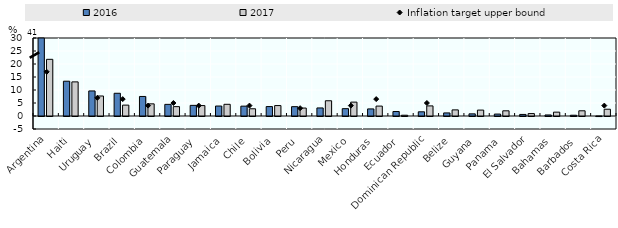
| Category | 2016 | 2017 |
|---|---|---|
| Argentina | 40.7 | 21.8 |
| Haiti | 13.378 | 13.125 |
| Uruguay | 9.639 | 7.693 |
| Brazil | 8.739 | 4.184 |
| Colombia | 7.513 | 4.675 |
| Guatemala | 4.472 | 3.605 |
| Paraguay | 4.087 | 4.011 |
| Jamaica | 3.831 | 4.5 |
| Chile | 3.787 | 2.777 |
| Bolivia | 3.625 | 4.011 |
| Peru | 3.593 | 3.057 |
| Nicaragua | 3.1 | 5.861 |
| Mexico | 2.822 | 5.342 |
| Honduras | 2.725 | 3.815 |
| Ecuador | 1.724 | 0.299 |
| Dominican Republic | 1.614 | 3.885 |
| Belize | 1.183 | 2.351 |
| Guyana | 0.827 | 2.272 |
| Panama | 0.74 | 2.001 |
| El Salvador | 0.604 | 0.929 |
| Bahamas | 0.402 | 1.48 |
| Barbados | 0.3 | 2.005 |
| Costa Rica | -0.017 | 2.604 |